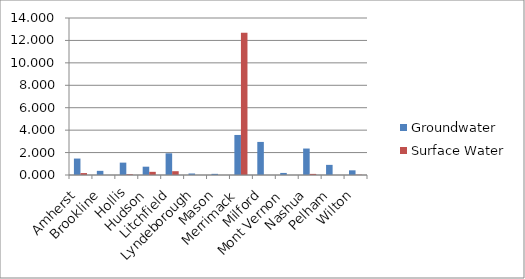
| Category | Groundwater | Surface Water |
|---|---|---|
| Amherst | 1.466 | 0.172 |
| Brookline | 0.371 | 0 |
| Hollis | 1.103 | 0.062 |
| Hudson | 0.742 | 0.282 |
| Litchfield | 1.934 | 0.339 |
| Lyndeborough | 0.134 | 0 |
| Mason | 0.102 | 0 |
| Merrimack | 3.57 | 12.687 |
| Milford | 2.949 | 0 |
| Mont Vernon | 0.184 | 0 |
| Nashua | 2.36 | 0.098 |
| Pelham | 0.904 | 0 |
| Wilton | 0.417 | 0.023 |